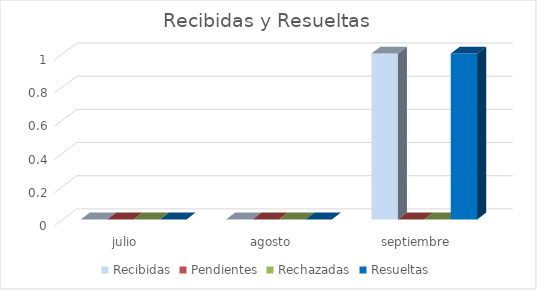
| Category | Recibidas | Pendientes | Rechazadas | Resueltas |
|---|---|---|---|---|
| julio | 0 | 0 | 0 | 0 |
| agosto | 0 | 0 | 0 | 0 |
| septiembre | 1 | 0 | 0 | 1 |